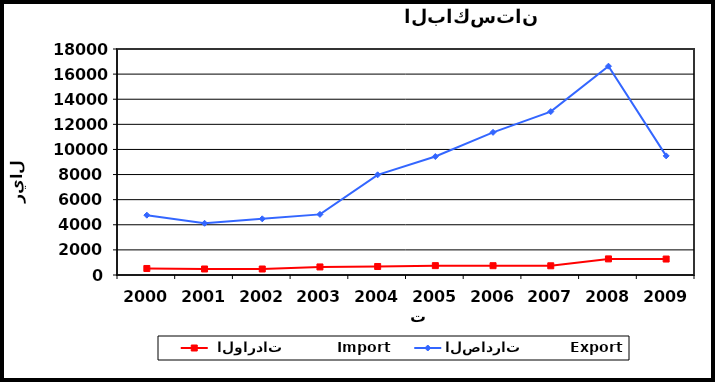
| Category |  الواردات           Import | الصادرات          Export |
|---|---|---|
| 2000.0 | 520 | 4766 |
| 2001.0 | 478 | 4119 |
| 2002.0 | 477 | 4474 |
| 2003.0 | 642 | 4828 |
| 2004.0 | 677 | 7979 |
| 2005.0 | 746 | 9435 |
| 2006.0 | 741 | 11363 |
| 2007.0 | 734 | 13015 |
| 2008.0 | 1283 | 16630 |
| 2009.0 | 1271 | 9487 |